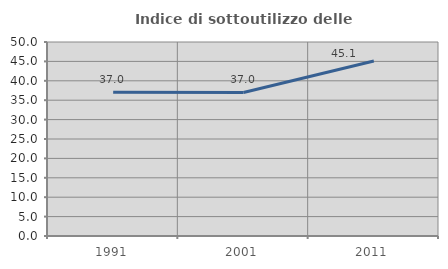
| Category | Indice di sottoutilizzo delle abitazioni  |
|---|---|
| 1991.0 | 37.025 |
| 2001.0 | 36.992 |
| 2011.0 | 45.113 |